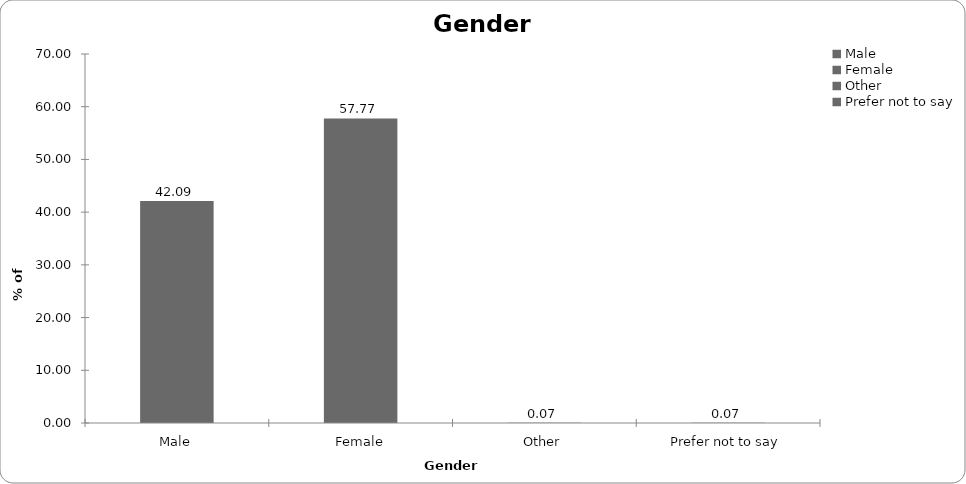
| Category | Series 0 |
|---|---|
| Male | 42.095 |
| Female | 57.772 |
| Other | 0.067 |
| Prefer not to say | 0.067 |